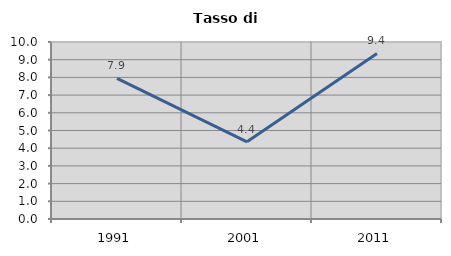
| Category | Tasso di disoccupazione   |
|---|---|
| 1991.0 | 7.949 |
| 2001.0 | 4.362 |
| 2011.0 | 9.353 |